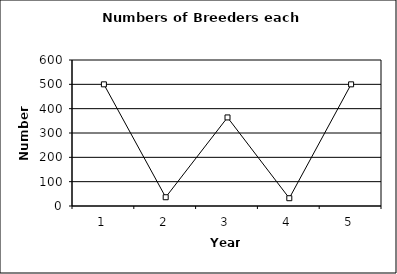
| Category | Series 1 |
|---|---|
| 0 | 500 |
| 1 | 36 |
| 2 | 364 |
| 3 | 32 |
| 4 | 500 |